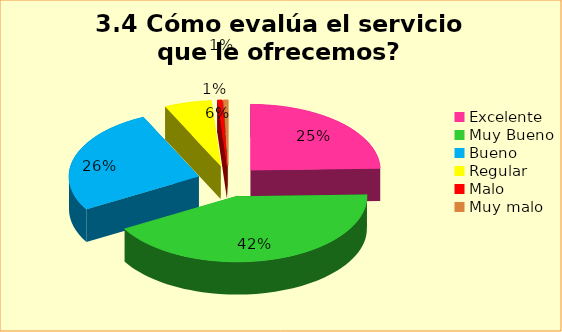
| Category | Series 0 |
|---|---|
| Excelente | 0.246 |
| Muy Bueno | 0.421 |
| Bueno  | 0.263 |
| Regular  | 0.058 |
| Malo  | 0.006 |
| Muy malo  | 0.006 |